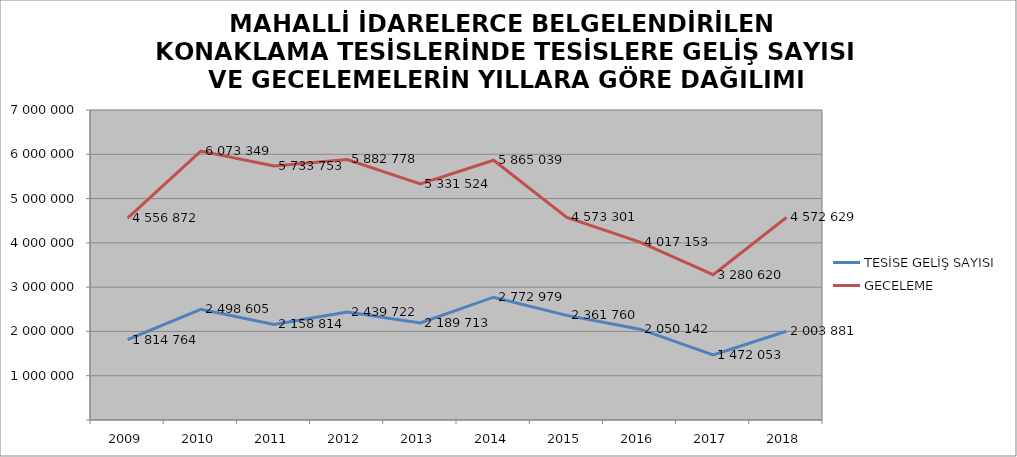
| Category | TESİSE GELİŞ SAYISI | GECELEME |
|---|---|---|
| 2009 | 1814764 | 4556872 |
| 2010 | 2498605 | 6073349 |
| 2011 | 2158814 | 5733753 |
| 2012 | 2439722 | 5882778 |
| 2013 | 2189713 | 5331524 |
| 2014 | 2772979 | 5865039 |
| 2015 | 2361760 | 4573301 |
| 2016 | 2050142 | 4017153 |
| 2017 | 1472053 | 3280620 |
| 2018 | 2003881 | 4572629 |